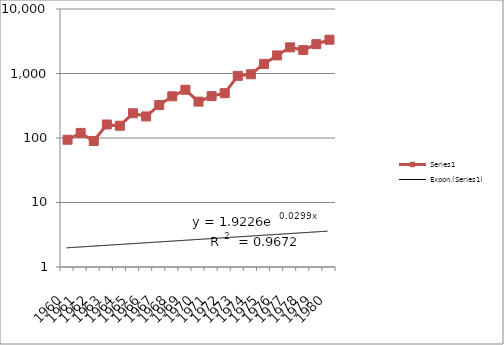
| Category | Series 1 |
|---|---|
| 1960.0 | 94 |
| 1961.0 | 120 |
| 1962.0 | 90 |
| 1963.0 | 162 |
| 1964.0 | 155 |
| 1965.0 | 242 |
| 1966.0 | 216 |
| 1967.0 | 324 |
| 1968.0 | 443 |
| 1969.0 | 559 |
| 1970.0 | 366 |
| 1971.0 | 446 |
| 1972.0 | 495 |
| 1973.0 | 920 |
| 1974.0 | 973 |
| 1975.0 | 1408 |
| 1976.0 | 1907 |
| 1977.0 | 2544 |
| 1978.0 | 2308 |
| 1979.0 | 2849 |
| 1980.0 | 3341 |